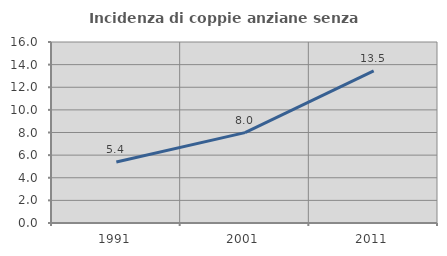
| Category | Incidenza di coppie anziane senza figli  |
|---|---|
| 1991.0 | 5.393 |
| 2001.0 | 7.991 |
| 2011.0 | 13.453 |